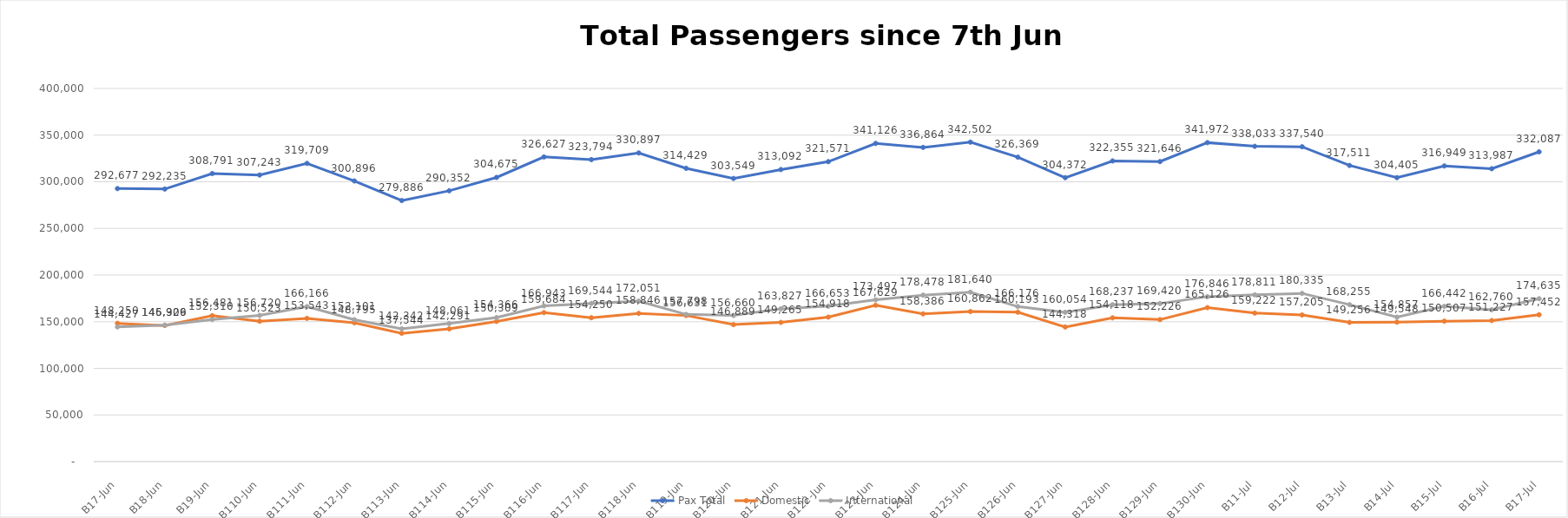
| Category | Pax Total |  Domestic  |  International  |
|---|---|---|---|
| 2023-06-07 | 292677 | 148250 | 144427 |
| 2023-06-08 | 292235 | 145926 | 146309 |
| 2023-06-09 | 308791 | 156481 | 152310 |
| 2023-06-10 | 307243 | 150523 | 156720 |
| 2023-06-11 | 319709 | 153543 | 166166 |
| 2023-06-12 | 300896 | 148795 | 152101 |
| 2023-06-13 | 279886 | 137544 | 142342 |
| 2023-06-14 | 290352 | 142291 | 148061 |
| 2023-06-15 | 304675 | 150309 | 154366 |
| 2023-06-16 | 326627 | 159684 | 166943 |
| 2023-06-17 | 323794 | 154250 | 169544 |
| 2023-06-18 | 330897 | 158846 | 172051 |
| 2023-06-19 | 314429 | 156631 | 157798 |
| 2023-06-20 | 303549 | 146889 | 156660 |
| 2023-06-21 | 313092 | 149265 | 163827 |
| 2023-06-22 | 321571 | 154918 | 166653 |
| 2023-06-23 | 341126 | 167629 | 173497 |
| 2023-06-24 | 336864 | 158386 | 178478 |
| 2023-06-25 | 342502 | 160862 | 181640 |
| 2023-06-26 | 326369 | 160193 | 166176 |
| 2023-06-27 | 304372 | 144318 | 160054 |
| 2023-06-28 | 322355 | 154118 | 168237 |
| 2023-06-29 | 321646 | 152226 | 169420 |
| 2023-06-30 | 341972 | 165126 | 176846 |
| 2023-07-01 | 338033 | 159222 | 178811 |
| 2023-07-02 | 337540 | 157205 | 180335 |
| 2023-07-03 | 317511 | 149256 | 168255 |
| 2023-07-04 | 304405 | 149548 | 154857 |
| 2023-07-05 | 316949 | 150507 | 166442 |
| 2023-07-06 | 313987 | 151227 | 162760 |
| 2023-07-07 | 332087 | 157452 | 174635 |